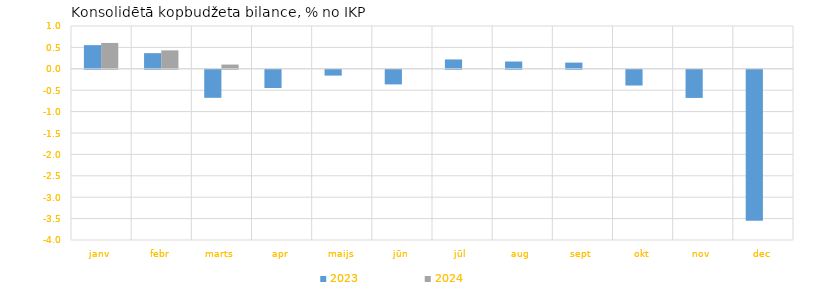
| Category | 2023 | 2024 |
|---|---|---|
| janv | 0.553 | 0.604 |
| febr | 0.365 | 0.431 |
| marts | -0.654 | 0.099 |
| apr | -0.426 | 0 |
| maijs | -0.136 | 0 |
| jūn | -0.341 | 0 |
| jūl | 0.219 | 0 |
| aug | 0.171 | 0 |
| sept | 0.145 | 0 |
| okt | -0.367 | 0 |
| nov | -0.657 | 0 |
| dec | -3.527 | 0 |